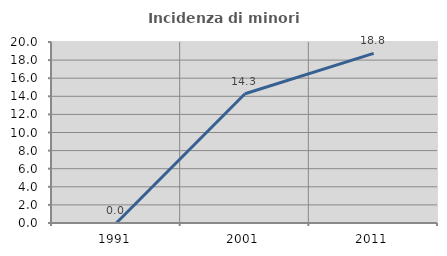
| Category | Incidenza di minori stranieri |
|---|---|
| 1991.0 | 0 |
| 2001.0 | 14.286 |
| 2011.0 | 18.75 |